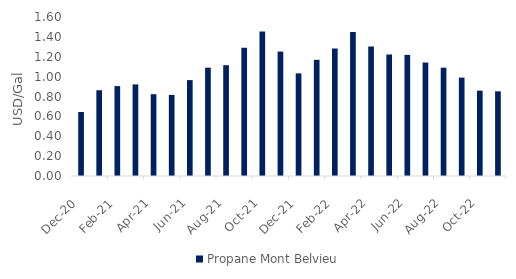
| Category | Propane Mont Belvieu |
|---|---|
| 2020-12-01 | 0.644 |
| 2021-01-01 | 0.863 |
| 2021-02-01 | 0.905 |
| 2021-03-01 | 0.922 |
| 2021-04-01 | 0.823 |
| 2021-05-01 | 0.816 |
| 2021-06-01 | 0.965 |
| 2021-07-01 | 1.09 |
| 2021-08-01 | 1.115 |
| 2021-09-01 | 1.291 |
| 2021-10-01 | 1.454 |
| 2021-11-01 | 1.252 |
| 2021-12-01 | 1.033 |
| 2022-01-01 | 1.169 |
| 2022-02-01 | 1.283 |
| 2022-03-01 | 1.448 |
| 2022-04-01 | 1.302 |
| 2022-05-01 | 1.223 |
| 2022-06-01 | 1.219 |
| 2022-07-01 | 1.142 |
| 2022-08-01 | 1.09 |
| 2022-09-01 | 0.99 |
| 2022-10-01 | 0.859 |
| 2022-11-01 | 0.852 |